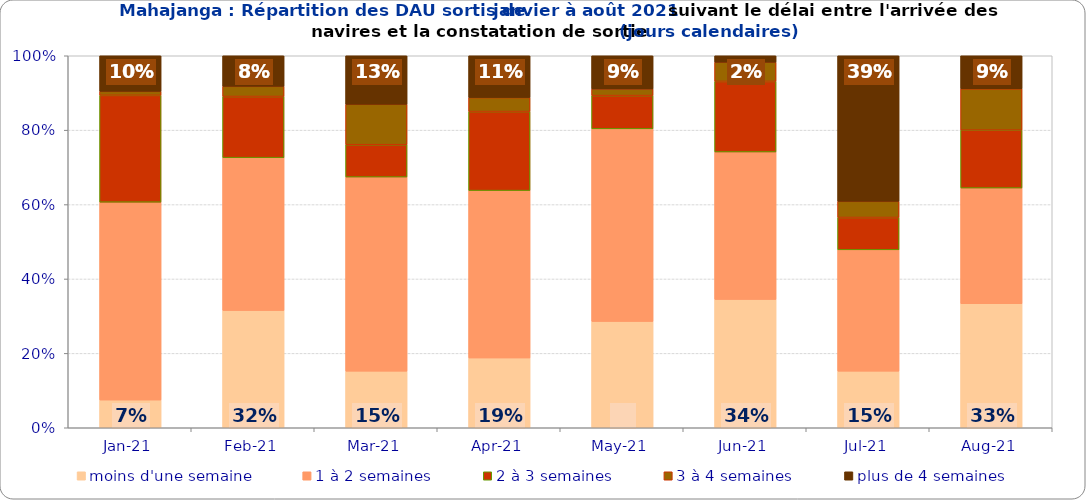
| Category | moins d'une semaine | 1 à 2 semaines | 2 à 3 semaines | 3 à 4 semaines | plus de 4 semaines |
|---|---|---|---|---|---|
| 2021-01-01 | 0.074 | 0.532 | 0.287 | 0.011 | 0.096 |
| 2021-02-01 | 0.315 | 0.411 | 0.164 | 0.027 | 0.082 |
| 2021-03-01 | 0.152 | 0.522 | 0.087 | 0.109 | 0.13 |
| 2021-04-01 | 0.188 | 0.45 | 0.212 | 0.038 | 0.112 |
| 2021-05-01 | 0.286 | 0.518 | 0.089 | 0.018 | 0.089 |
| 2021-06-01 | 0.345 | 0.397 | 0.19 | 0.052 | 0.017 |
| 2021-07-01 | 0.152 | 0.326 | 0.087 | 0.043 | 0.391 |
| 2021-08-01 | 0.333 | 0.311 | 0.156 | 0.111 | 0.089 |